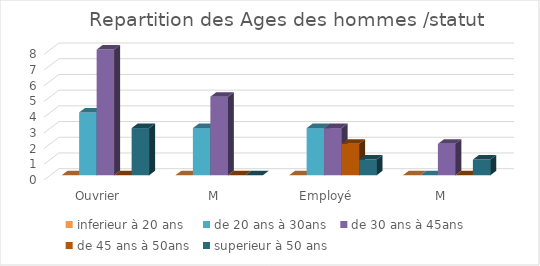
| Category | inferieur à 20 ans  | de 20 ans à 30ans | de 30 ans à 45ans | de 45 ans à 50ans | superieur à 50 ans  |
|---|---|---|---|---|---|
| 0 | 0 | 4 | 8 | 0 | 3 |
| 1 | 0 | 3 | 5 | 0 | 0 |
| 2 | 0 | 3 | 3 | 2 | 1 |
| 3 | 0 | 0 | 2 | 0 | 1 |